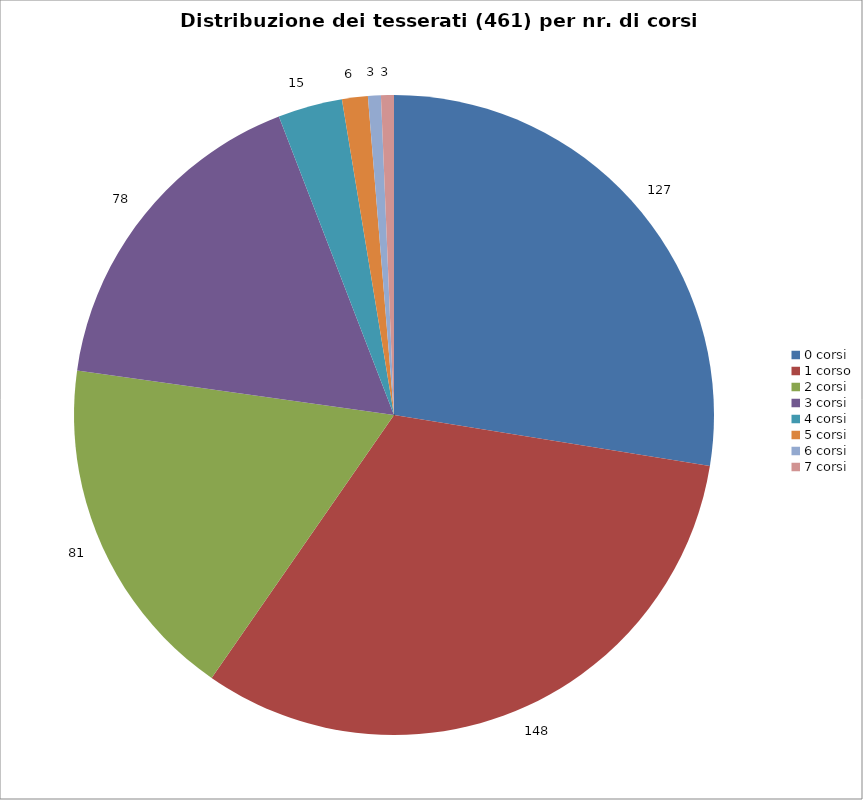
| Category | Nr. Tesserati |
|---|---|
| 0 corsi | 127 |
| 1 corso | 148 |
| 2 corsi | 81 |
| 3 corsi | 78 |
| 4 corsi | 15 |
| 5 corsi | 6 |
| 6 corsi | 3 |
| 7 corsi | 3 |